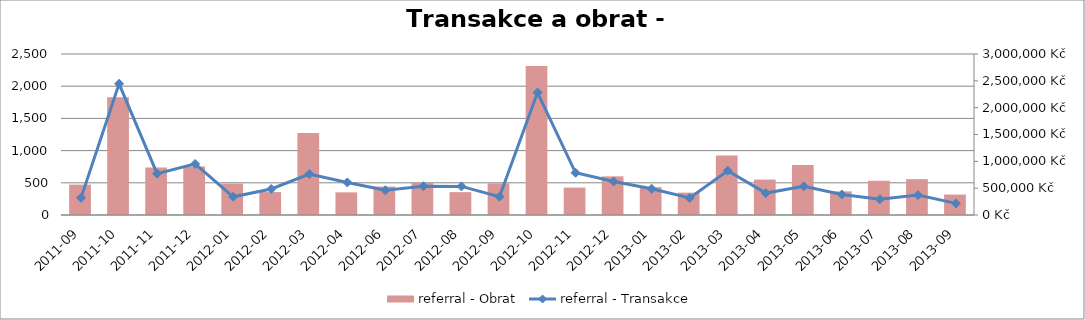
| Category | referral - Obrat |
|---|---|
| 2011-09 | 566162.747 |
| 2011-10 | 2192852.522 |
| 2011-11 | 885749.523 |
| 2011-12 | 901659.911 |
| 2012-01 | 586295.278 |
| 2012-02 | 427360.018 |
| 2012-03 | 1529313.188 |
| 2012-04 | 421456.22 |
| 2012-06 | 530240.846 |
| 2012-07 | 598849.37 |
| 2012-08 | 425919.301 |
| 2012-09 | 589392.394 |
| 2012-10 | 2775659.575 |
| 2012-11 | 511218.145 |
| 2012-12 | 719754.44 |
| 2013-01 | 520195.389 |
| 2013-02 | 416525.557 |
| 2013-03 | 1107369.584 |
| 2013-04 | 659841.82 |
| 2013-05 | 930667.596 |
| 2013-06 | 440137.497 |
| 2013-07 | 638038.348 |
| 2013-08 | 667548.28 |
| 2013-09 | 380685.352 |